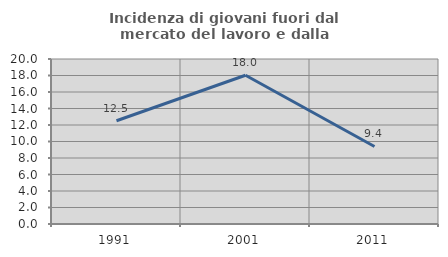
| Category | Incidenza di giovani fuori dal mercato del lavoro e dalla formazione  |
|---|---|
| 1991.0 | 12.518 |
| 2001.0 | 18.028 |
| 2011.0 | 9.399 |